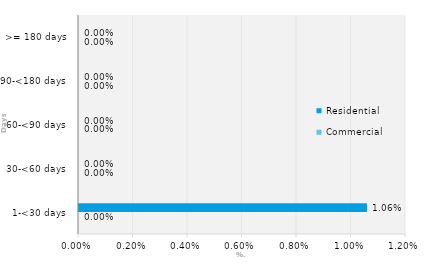
| Category | Commercial | Residential |
|---|---|---|
| 1-<30 days | 0 | 0.011 |
| 30-<60 days | 0 | 0 |
| 60-<90 days | 0 | 0 |
| 90-<180 days | 0 | 0 |
| >= 180 days | 0 | 0 |